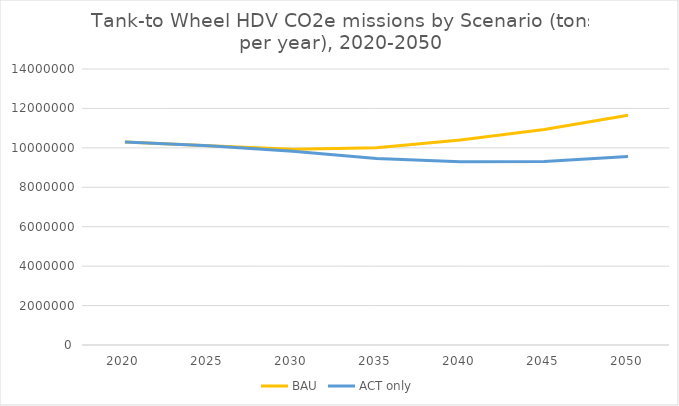
| Category | BAU | ACT only |
|---|---|---|
| 2020.0 | 10298919.031 | 10298919.031 |
| 2025.0 | 10104487.058 | 10104487.058 |
| 2030.0 | 9932362.782 | 9830654.746 |
| 2035.0 | 10010262.267 | 9460958.869 |
| 2040.0 | 10402704.857 | 9297471.163 |
| 2045.0 | 10935610.382 | 9303726.735 |
| 2050.0 | 11650066.56 | 9558185.644 |